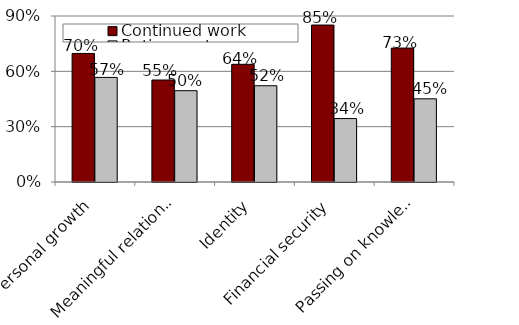
| Category | Continued work | Retirement |
|---|---|---|
| Personal growth | 0.697 | 0.567 |
| Meaningful relationships | 0.553 | 0.495 |
| Identity | 0.638 | 0.522 |
| Financial security | 0.851 | 0.344 |
| Passing on knowledge and values | 0.726 | 0.451 |